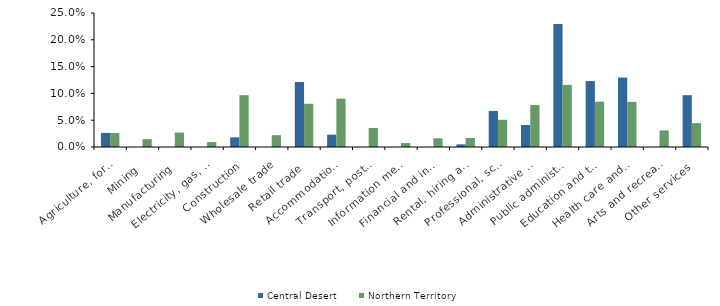
| Category | Central Desert | Northern Territory |
|---|---|---|
| Agriculture, forestry and fishing | 0.026 | 0.026 |
| Mining | 0 | 0.015 |
| Manufacturing | 0 | 0.027 |
| Electricity, gas, water and waste services | 0 | 0.009 |
| Construction | 0.018 | 0.097 |
| Wholesale trade | 0 | 0.022 |
| Retail trade | 0.121 | 0.081 |
| Accommodation and food services | 0.023 | 0.09 |
| Transport, postal and warehousing | 0 | 0.035 |
| Information media and telecommunications | 0 | 0.007 |
| Financial and insurance services | 0 | 0.016 |
| Rental, hiring and real estate services | 0.005 | 0.017 |
| Professional, scientific and technical services | 0.067 | 0.051 |
| Administrative and support services | 0.041 | 0.078 |
| Public administration and safety | 0.23 | 0.116 |
| Education and training | 0.123 | 0.084 |
| Health care and social assistance | 0.13 | 0.084 |
| Arts and recreation services | 0 | 0.031 |
| Other services | 0.097 | 0.045 |